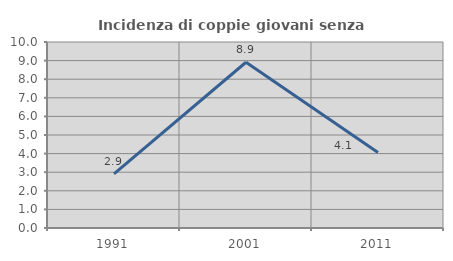
| Category | Incidenza di coppie giovani senza figli |
|---|---|
| 1991.0 | 2.913 |
| 2001.0 | 8.911 |
| 2011.0 | 4.054 |